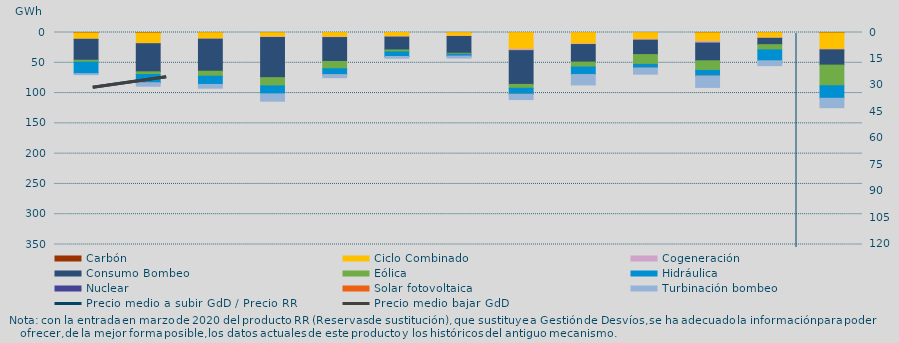
| Category | Carbón | Ciclo Combinado | Cogeneración | Consumo Bombeo | Eólica | Hidráulica | Nuclear | Solar fotovoltaica | Turbinación bombeo |
|---|---|---|---|---|---|---|---|---|---|
| 0 | 591.9 | 10439.5 | 218.3 | 34537.4 | 3140.7 | 19023.8 | 0 | 0 | 1658.4 |
| 1 | 683.9 | 17734.4 | 130.3 | 46367.6 | 4484.5 | 13296.6 | 160.1 | 0 | 5844.4 |
| 2 | 266 | 10455 | 302 | 52908 | 8236.7 | 13611 | 0 | 0 | 6180 |
| 3 | 248 | 7191 | 798 | 66283 | 13648 | 13179 | 0 | 0 | 12053 |
| 4 | 93 | 7535.7 | 753.6 | 39389.7 | 12105 | 9573 | 17 | 101 | 5032 |
| 5 | 66 | 7025.7 | 507 | 21162.5 | 3300.1 | 7480.7 | 105 | 0 | 2862 |
| 6 | 123 | 5966.1 | 490 | 27694.8 | 1620.1 | 2791 | 87.8 | 0 | 3441.2 |
| 7 | 152 | 27645.5 | 2170 | 55738 | 6361 | 9936.8 | 0 | 35 | 8686.7 |
| 8 | 154 | 18699.7 | 1014 | 28968.4 | 8108 | 12439.1 | 0 | 43.5 | 17149.3 |
| 9 | 129 | 11392.3 | 1219.7 | 23755.5 | 16146.7 | 6094.5 | 0 | 10.7 | 10042 |
| 10 | 443.1 | 14439.5 | 2552.5 | 29306.4 | 15889.4 | 9269.4 | 0 | 12.8 | 18717.8 |
| 11 | 236 | 8945 | 460.2 | 10384 | 8743.8 | 17985.5 | 0 | 0 | 7919.9 |
| 12 | 624 | 27339.5 | 701.7 | 25190.3 | 34060.3 | 20705 | 0 | 0 | 15547.2 |